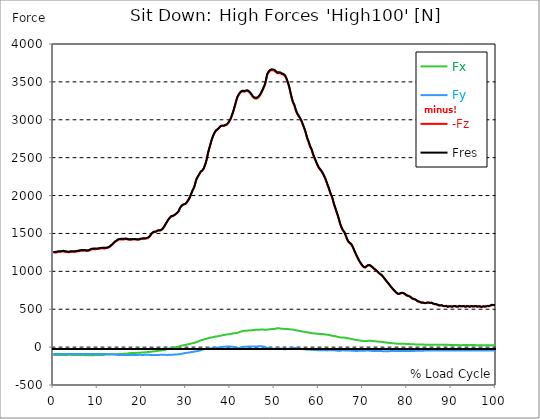
| Category |  Fx |  Fy |  -Fz |  Fres |
|---|---|---|---|---|
| 0.0 | -102.893 | -89.936 | 1247.755 | 1255.406 |
| 0.167348456675344 | -103.119 | -89.895 | 1247.982 | 1255.653 |
| 0.334696913350688 | -103.428 | -89.854 | 1248.557 | 1256.249 |
| 0.5020453700260321 | -103.366 | -89.998 | 1249.401 | 1257.092 |
| 0.669393826701376 | -102.831 | -90.306 | 1249.75 | 1257.421 |
| 0.83674228337672 | -102.831 | -90.121 | 1252.074 | 1259.704 |
| 1.0040907400520642 | -103.16 | -89.792 | 1255.612 | 1263.221 |
| 1.1621420602454444 | -103.428 | -89.895 | 1256.64 | 1264.27 |
| 1.3294905169207885 | -103.654 | -90.06 | 1257.298 | 1264.969 |
| 1.4968389735961325 | -103.345 | -90.45 | 1257.092 | 1264.764 |
| 1.6641874302714765 | -103.243 | -90.862 | 1257.792 | 1265.483 |
| 1.8315358869468206 | -103.469 | -91.15 | 1259.684 | 1267.417 |
| 1.9988843436221646 | -104.004 | -91.273 | 1261.74 | 1269.494 |
| 2.1662328002975086 | -104.168 | -91.273 | 1262.419 | 1270.193 |
| 2.333581256972853 | -104.189 | -91.417 | 1262.501 | 1270.275 |
| 2.5009297136481967 | -104.765 | -91.335 | 1261.041 | 1268.856 |
| 2.6682781703235405 | -104.148 | -91.787 | 1256.475 | 1264.291 |
| 2.8356266269988843 | -103.243 | -91.52 | 1256.208 | 1263.941 |
| 3.002975083674229 | -103.345 | -91.109 | 1255.961 | 1263.674 |
| 3.1703235403495724 | -103.407 | -91.273 | 1252.938 | 1260.691 |
| 3.337671997024917 | -102.358 | -91.396 | 1251.622 | 1259.314 |
| 3.4957233172182973 | -101.885 | -91.355 | 1252.054 | 1259.684 |
| 3.663071773893641 | -101.782 | -91.253 | 1253 | 1260.609 |
| 3.8304202305689854 | -101.844 | -91.191 | 1254.645 | 1262.255 |
| 3.997768687244329 | -102.461 | -91.191 | 1257.812 | 1265.442 |
| 4.165117143919673 | -103.428 | -91.191 | 1258.306 | 1265.998 |
| 4.332465600595017 | -103.448 | -91.623 | 1258.47 | 1266.203 |
| 4.499814057270361 | -103.777 | -91.726 | 1258.82 | 1266.573 |
| 4.667162513945706 | -103.777 | -91.787 | 1256.619 | 1264.414 |
| 4.834510970621049 | -103.202 | -91.993 | 1254.624 | 1262.398 |
| 5.001859427296393 | -102.831 | -91.808 | 1257.113 | 1264.825 |
| 5.169207883971737 | -103.551 | -91.294 | 1260.918 | 1268.61 |
| 5.336556340647081 | -104.312 | -91.17 | 1263.324 | 1271.077 |
| 5.503904797322425 | -105.155 | -91.582 | 1263.735 | 1271.571 |
| 5.671253253997769 | -104.6 | -91.787 | 1264.249 | 1272.044 |
| 5.82930457419115 | -104.497 | -91.828 | 1266.635 | 1274.409 |
| 5.996653030866494 | -104.847 | -91.787 | 1269.741 | 1277.515 |
| 6.164001487541838 | -105.279 | -91.643 | 1272.394 | 1280.188 |
| 6.331349944217181 | -105.628 | -91.643 | 1273.813 | 1281.628 |
| 6.498698400892526 | -105.32 | -91.972 | 1273.319 | 1281.134 |
| 6.66604685756787 | -104.415 | -92.63 | 1271.098 | 1278.913 |
| 6.833395314243213 | -103.983 | -92.61 | 1273.443 | 1281.196 |
| 7.000743770918558 | -105.628 | -92.425 | 1274.635 | 1282.512 |
| 7.168092227593902 | -106.184 | -92.322 | 1272.25 | 1280.168 |
| 7.335440684269246 | -105.978 | -92.301 | 1269.987 | 1277.926 |
| 7.50278914094459 | -105.238 | -92.178 | 1268.671 | 1276.528 |
| 7.6701375976199335 | -105.608 | -91.808 | 1268.877 | 1276.713 |
| 7.837486054295278 | -105.855 | -92.116 | 1269.617 | 1277.494 |
| 7.995537374488658 | -106.101 | -92.219 | 1272.579 | 1280.476 |
| 8.162885831164003 | -107.562 | -91.89 | 1277.186 | 1285.145 |
| 8.330234287839346 | -107.767 | -91.849 | 1280.661 | 1288.62 |
| 8.49758274451469 | -107.623 | -91.602 | 1284.055 | 1291.973 |
| 8.664931201190035 | -107.376 | -91.047 | 1290.842 | 1298.657 |
| 8.832279657865378 | -107.027 | -91.047 | 1292.014 | 1299.767 |
| 8.999628114540721 | -105.834 | -90.903 | 1292.302 | 1299.973 |
| 9.166976571216066 | -106.574 | -90.759 | 1293.639 | 1301.351 |
| 9.334325027891412 | -106.06 | -90.862 | 1291.993 | 1299.685 |
| 9.501673484566755 | -105.32 | -90.841 | 1292.034 | 1299.665 |
| 9.669021941242098 | -105.011 | -90.759 | 1293.145 | 1300.755 |
| 9.836370397917442 | -106.369 | -89.998 | 1296.847 | 1304.498 |
| 10.003718854592787 | -105.546 | -90.409 | 1294.276 | 1301.906 |
| 10.17106731126813 | -104.847 | -90.224 | 1295.675 | 1303.243 |
| 10.329118631461512 | -104.538 | -90.265 | 1297.793 | 1305.32 |
| 10.496467088136853 | -105.258 | -90.43 | 1300.611 | 1308.22 |
| 10.663815544812199 | -104.374 | -90.985 | 1300.94 | 1308.529 |
| 10.831164001487544 | -104.477 | -91.479 | 1303.325 | 1310.955 |
| 10.998512458162887 | -104.662 | -91.705 | 1304.086 | 1311.758 |
| 11.16586091483823 | -103.345 | -91.767 | 1304.477 | 1312.025 |
| 11.333209371513574 | -102.317 | -91.952 | 1302.77 | 1310.277 |
| 11.50055782818892 | -100.59 | -91.931 | 1302.667 | 1310.071 |
| 11.667906284864264 | -99.5 | -91.911 | 1302.729 | 1310.051 |
| 11.835254741539607 | -98.554 | -92.034 | 1302.462 | 1309.721 |
| 12.00260319821495 | -98.41 | -92.343 | 1305.464 | 1312.765 |
| 12.169951654890292 | -97.546 | -92.816 | 1307.274 | 1314.513 |
| 12.337300111565641 | -98.286 | -93.021 | 1310.955 | 1318.256 |
| 12.504648568240984 | -96.785 | -93.556 | 1312.642 | 1319.881 |
| 12.662699888434362 | -96.332 | -93.947 | 1318.976 | 1326.195 |
| 12.830048345109708 | -95.839 | -94.461 | 1326.277 | 1333.496 |
| 12.997396801785053 | -94.831 | -94.749 | 1335.758 | 1342.915 |
| 13.164745258460396 | -94.79 | -94.831 | 1344.684 | 1351.841 |
| 13.33209371513574 | -94.276 | -95.469 | 1351.142 | 1358.32 |
| 13.499442171811083 | -94.111 | -96.086 | 1360.335 | 1367.533 |
| 13.666790628486426 | -94.625 | -96.764 | 1372.346 | 1379.606 |
| 13.834139085161771 | -94.296 | -97.649 | 1382.403 | 1389.683 |
| 14.001487541837117 | -93.741 | -98.122 | 1390.197 | 1397.478 |
| 14.16883599851246 | -93.638 | -99.191 | 1396.449 | 1403.75 |
| 14.336184455187803 | -93.145 | -100.878 | 1401.488 | 1408.81 |
| 14.503532911863147 | -92.672 | -102.399 | 1408.563 | 1415.905 |
| 14.670881368538492 | -92.137 | -103.819 | 1416.111 | 1423.494 |
| 14.828932688731873 | -91.746 | -104.189 | 1420.224 | 1427.587 |
| 14.996281145407215 | -91.253 | -104.538 | 1420.491 | 1427.834 |
| 15.163629602082558 | -90.43 | -104.518 | 1420.471 | 1427.751 |
| 15.330978058757903 | -91.17 | -104.497 | 1421.561 | 1428.903 |
| 15.498326515433247 | -91.067 | -104.579 | 1421.499 | 1428.862 |
| 15.665674972108594 | -90.142 | -105.011 | 1420.985 | 1428.327 |
| 15.833023428783937 | -89.237 | -105.526 | 1421.088 | 1428.409 |
| 16.00037188545928 | -88.147 | -105.711 | 1421.273 | 1428.533 |
| 16.167720342134626 | -87.777 | -105.937 | 1423.947 | 1431.186 |
| 16.335068798809967 | -87.88 | -105.649 | 1426.085 | 1433.284 |
| 16.502417255485312 | -86.419 | -105.464 | 1424.893 | 1431.988 |
| 16.669765712160658 | -84.754 | -105.155 | 1423.083 | 1430.055 |
| 16.837114168836 | -82.8 | -104.6 | 1420.347 | 1427.196 |
| 17.004462625511344 | -81.586 | -104.25 | 1418.147 | 1424.913 |
| 17.16251394570472 | -80.414 | -103.901 | 1416.234 | 1422.939 |
| 17.32986240238007 | -79.427 | -103.263 | 1417.962 | 1424.584 |
| 17.497210859055414 | -78.933 | -102.975 | 1417.9 | 1424.522 |
| 17.664559315730756 | -78.357 | -102.996 | 1417.735 | 1424.317 |
| 17.8319077724061 | -78.769 | -103.016 | 1420.409 | 1427.031 |
| 17.999256229081443 | -78.419 | -102.955 | 1421.355 | 1427.957 |
| 18.166604685756788 | -78.049 | -102.667 | 1421.335 | 1427.916 |
| 18.333953142432133 | -77 | -102.749 | 1420.43 | 1426.97 |
| 18.501301599107478 | -76.445 | -103.058 | 1420.615 | 1427.134 |
| 18.668650055782823 | -76.753 | -102.811 | 1419.196 | 1425.756 |
| 18.835998512458165 | -75.89 | -103.078 | 1416.296 | 1422.836 |
| 19.00334696913351 | -75.581 | -102.975 | 1415.555 | 1422.075 |
| 19.170695425808855 | -75.293 | -102.831 | 1415.062 | 1421.561 |
| 19.338043882484197 | -74.368 | -102.297 | 1417.365 | 1423.782 |
| 19.496095202677576 | -73.936 | -101.7 | 1421.047 | 1427.402 |
| 19.66344365935292 | -73.463 | -101.577 | 1424.296 | 1430.631 |
| 19.830792116028263 | -72.229 | -102.667 | 1424.995 | 1431.33 |
| 19.998140572703612 | -71.941 | -103.14 | 1427.875 | 1434.189 |
| 20.165489029378953 | -71.447 | -102.914 | 1430.055 | 1436.348 |
| 20.3328374860543 | -71.015 | -102.749 | 1429.582 | 1435.834 |
| 20.500185942729644 | -70.193 | -102.564 | 1428.841 | 1435.052 |
| 20.667534399404985 | -68.897 | -102.297 | 1429.314 | 1435.422 |
| 20.83488285608033 | -67.807 | -102.214 | 1432.749 | 1438.816 |
| 21.002231312755672 | -67.211 | -102.276 | 1432.625 | 1438.693 |
| 21.16957976943102 | -65.956 | -102.07 | 1435.443 | 1441.407 |
| 21.336928226106362 | -65.483 | -101.762 | 1439.001 | 1444.924 |
| 21.504276682781704 | -64.804 | -101.68 | 1442.785 | 1448.667 |
| 21.67162513945705 | -63.858 | -101.947 | 1451.115 | 1456.935 |
| 21.82967645965043 | -62.912 | -102.07 | 1461.603 | 1467.362 |
| 21.997024916325774 | -61.575 | -103.263 | 1476.946 | 1482.663 |
| 22.16437337300112 | -60.3 | -104.312 | 1491.939 | 1497.635 |
| 22.33172182967646 | -58.717 | -104.435 | 1503.25 | 1508.885 |
| 22.499070286351806 | -57.215 | -104.004 | 1510.078 | 1515.631 |
| 22.666418743027148 | -55.817 | -103.839 | 1515.466 | 1520.937 |
| 22.833767199702496 | -55.035 | -104.045 | 1518.634 | 1524.063 |
| 23.00111565637784 | -54.418 | -104.065 | 1519.868 | 1525.235 |
| 23.168464113053183 | -53.061 | -104.168 | 1520.217 | 1525.503 |
| 23.335812569728528 | -51.95 | -104.127 | 1525.215 | 1530.439 |
| 23.50316102640387 | -50.346 | -103.921 | 1532.434 | 1537.575 |
| 23.670509483079215 | -48.907 | -103.654 | 1536.382 | 1541.442 |
| 23.83785793975456 | -47.446 | -103.551 | 1538.459 | 1543.437 |
| 23.995909259947936 | -46.212 | -103.037 | 1538.418 | 1543.272 |
| 24.163257716623285 | -45.349 | -101.926 | 1537.719 | 1542.449 |
| 24.330606173298627 | -44.3 | -101.556 | 1541.236 | 1545.904 |
| 24.49795462997397 | -42.901 | -101.063 | 1547.653 | 1552.259 |
| 24.665303086649313 | -41.832 | -101.803 | 1557.01 | 1561.617 |
| 24.83265154332466 | -40.084 | -102.399 | 1568.61 | 1573.216 |
| 25.0 | -37.842 | -102.646 | 1581.073 | 1585.618 |
| 25.167348456675345 | -34.86 | -102.235 | 1597.67 | 1602.174 |
| 25.334696913350694 | -31.569 | -101.515 | 1616.015 | 1620.478 |
| 25.502045370026035 | -29.533 | -102.461 | 1632.694 | 1637.178 |
| 25.669393826701377 | -26.243 | -103.325 | 1647.461 | 1651.965 |
| 25.836742283376722 | -22.87 | -102.194 | 1665.6 | 1670.104 |
| 26.004090740052067 | -20.731 | -102.194 | 1681.498 | 1686.022 |
| 26.17143919672741 | -19.291 | -103.016 | 1693.879 | 1698.424 |
| 26.329490516920792 | -17.132 | -102.934 | 1704.47 | 1708.974 |
| 26.49683897359613 | -14.499 | -102.132 | 1715.329 | 1719.772 |
| 26.66418743027148 | -12.299 | -101.186 | 1725.345 | 1729.767 |
| 26.831535886946828 | -11.106 | -101.186 | 1727.361 | 1731.721 |
| 26.998884343622166 | -9.46 | -100.59 | 1728.924 | 1733.16 |
| 27.166232800297514 | -7.712 | -99.973 | 1730.877 | 1735.011 |
| 27.333581256972852 | -5.162 | -98.533 | 1738.672 | 1742.724 |
| 27.5009297136482 | -3.311 | -97.916 | 1746.138 | 1750.127 |
| 27.668278170323543 | -1.707 | -97.422 | 1753.912 | 1757.84 |
| 27.835626626998888 | -0.35 | -97.381 | 1761.912 | 1765.799 |
| 28.002975083674233 | 1.584 | -95.571 | 1769.439 | 1773.203 |
| 28.170323540349575 | 3.805 | -94.214 | 1778.797 | 1782.458 |
| 28.33767199702492 | 6.273 | -92.528 | 1792.124 | 1795.682 |
| 28.50502045370026 | 10.077 | -92.404 | 1816.022 | 1819.621 |
| 28.663071773893645 | 13.759 | -93.145 | 1836.012 | 1839.714 |
| 28.830420230568986 | 16.905 | -91.026 | 1851.478 | 1855.18 |
| 28.99776868724433 | 19.476 | -88.168 | 1863.962 | 1867.623 |
| 29.165117143919673 | 21.163 | -86.029 | 1871.53 | 1875.109 |
| 29.33246560059502 | 22.849 | -83.91 | 1878.811 | 1882.286 |
| 29.499814057270367 | 24.556 | -82.183 | 1882.924 | 1886.358 |
| 29.66716251394571 | 26.592 | -80.394 | 1884.384 | 1887.757 |
| 29.834510970621054 | 28.916 | -77.946 | 1887.428 | 1890.698 |
| 30.00185942729639 | 30.829 | -76.26 | 1896.765 | 1899.953 |
| 30.169207883971744 | 32.968 | -74.923 | 1908.776 | 1911.963 |
| 30.33655634064708 | 35.456 | -74.203 | 1923.357 | 1926.545 |
| 30.50390479732243 | 37.842 | -73.134 | 1937.589 | 1940.756 |
| 30.671253253997772 | 39.919 | -72.146 | 1955.523 | 1958.669 |
| 30.829304574191156 | 42.922 | -69.864 | 1973.765 | 1976.85 |
| 30.996653030866494 | 45.225 | -67.334 | 1995.833 | 1998.856 |
| 31.164001487541842 | 46.562 | -66.326 | 2021.828 | 2024.831 |
| 31.331349944217187 | 48.619 | -65.154 | 2046.364 | 2049.305 |
| 31.498698400892525 | 51.292 | -64.146 | 2068.637 | 2071.517 |
| 31.666046857567874 | 53.287 | -61.884 | 2087.435 | 2090.191 |
| 31.833395314243212 | 55.549 | -59.848 | 2109.811 | 2112.464 |
| 32.00074377091856 | 58.573 | -58.593 | 2141.771 | 2144.424 |
| 32.1680922275939 | 62.069 | -57.503 | 2178.502 | 2181.238 |
| 32.33544068426925 | 65.504 | -55.652 | 2210.771 | 2213.568 |
| 32.50278914094459 | 68.918 | -53.267 | 2232.077 | 2234.833 |
| 32.670137597619934 | 73.175 | -51.333 | 2248.757 | 2251.492 |
| 32.83748605429528 | 77.884 | -50.346 | 2265.703 | 2268.48 |
| 33.004834510970625 | 81.628 | -46.274 | 2282.177 | 2284.871 |
| 33.162885831164004 | 85.227 | -41.688 | 2298.568 | 2301.18 |
| 33.33023428783935 | 89.196 | -39.426 | 2315.926 | 2318.558 |
| 33.497582744514695 | 91.931 | -36.649 | 2322.589 | 2325.304 |
| 33.664931201190036 | 94.358 | -33.461 | 2328.183 | 2330.939 |
| 33.83227965786538 | 97.155 | -30.603 | 2337.5 | 2340.359 |
| 33.99962811454073 | 100.219 | -29.595 | 2356.051 | 2359.074 |
| 34.16697657121607 | 102.749 | -27.97 | 2381.903 | 2385.008 |
| 34.33432502789141 | 105.443 | -25.194 | 2407.816 | 2410.942 |
| 34.50167348456676 | 107.87 | -23.116 | 2438.707 | 2441.853 |
| 34.6690219412421 | 109.968 | -21.553 | 2475.006 | 2478.194 |
| 34.83637039791744 | 112.888 | -20.052 | 2520.745 | 2524.036 |
| 35.00371885459279 | 116.611 | -19.065 | 2567.246 | 2570.66 |
| 35.17106731126814 | 119.593 | -17.872 | 2603.401 | 2606.856 |
| 35.338415767943474 | 121.855 | -16.885 | 2637.521 | 2641.038 |
| 35.49646708813686 | 124.22 | -16.7 | 2672.586 | 2676.185 |
| 35.6638155448122 | 126.688 | -17.049 | 2708.042 | 2711.724 |
| 35.831164001487544 | 128.107 | -16.803 | 2740.825 | 2744.527 |
| 35.998512458162885 | 130.452 | -16.309 | 2767.438 | 2771.263 |
| 36.165860914838234 | 132.981 | -14.993 | 2791.665 | 2795.572 |
| 36.333209371513576 | 135.141 | -14.232 | 2813.157 | 2817.167 |
| 36.50055782818892 | 137.876 | -12.772 | 2831.81 | 2835.965 |
| 36.667906284864266 | 139.151 | -11.085 | 2846.906 | 2851.122 |
| 36.83525474153961 | 140.241 | -9.214 | 2860.336 | 2864.593 |
| 37.002603198214956 | 141.681 | -7.589 | 2867.513 | 2871.873 |
| 37.1699516548903 | 143.409 | -6.232 | 2872.778 | 2877.241 |
| 37.337300111565646 | 144.93 | -4.936 | 2881.231 | 2885.776 |
| 37.50464856824098 | 146.823 | -3.517 | 2892.892 | 2897.54 |
| 37.66269988843437 | 149.105 | -1.789 | 2904.964 | 2909.756 |
| 37.83004834510971 | 151.429 | -0.103 | 2913.643 | 2918.6 |
| 37.99739680178505 | 153.753 | 1.563 | 2918.394 | 2923.515 |
| 38.16474525846039 | 155.851 | 3.085 | 2919.032 | 2924.317 |
| 38.33209371513574 | 157.743 | 3.599 | 2918.847 | 2924.276 |
| 38.49944217181109 | 159.635 | 4.134 | 2918.662 | 2924.235 |
| 38.666790628486424 | 161.137 | 4.648 | 2921.788 | 2927.484 |
| 38.83413908516178 | 162.659 | 5.656 | 2924.132 | 2929.952 |
| 39.001487541837115 | 164.242 | 6.561 | 2927.361 | 2933.325 |
| 39.16883599851246 | 166.031 | 7.095 | 2933.346 | 2939.433 |
| 39.336184455187805 | 167.78 | 7.712 | 2939.783 | 2946.015 |
| 39.503532911863154 | 168.89 | 7.795 | 2950.909 | 2957.244 |
| 39.670881368538495 | 169.754 | 7.404 | 2966.56 | 2972.956 |
| 39.83822982521384 | 170.988 | 7.815 | 2983.157 | 2989.656 |
| 39.996281145407224 | 172.078 | 7.774 | 3000.392 | 3006.973 |
| 40.163629602082565 | 173.6 | 7.239 | 3021.287 | 3027.971 |
| 40.33097805875791 | 175.903 | 5.779 | 3049.031 | 3055.859 |
| 40.498326515433256 | 178.885 | 5.903 | 3076.981 | 3083.953 |
| 40.6656749721086 | 181.867 | 4.607 | 3104.272 | 3111.388 |
| 40.83302342878393 | 182.361 | 2.447 | 3138.104 | 3145.22 |
| 41.00037188545929 | 183.081 | -0.165 | 3171.01 | 3178.146 |
| 41.16772034213463 | 183.718 | -3.62 | 3206.178 | 3213.376 |
| 41.33506879880997 | 184.521 | -7.363 | 3242.724 | 3249.984 |
| 41.50241725548531 | 186.803 | -10.571 | 3277.851 | 3285.214 |
| 41.66976571216066 | 188.49 | -11.455 | 3302.058 | 3309.482 |
| 41.837114168836 | 192.212 | -10.9 | 3319.786 | 3327.498 |
| 42.004462625511344 | 196.161 | -10.612 | 3336.424 | 3344.445 |
| 42.17181108218669 | 200.398 | -9.543 | 3349.936 | 3358.307 |
| 42.32986240238007 | 204.367 | -7.383 | 3361.7 | 3370.4 |
| 42.497210859055414 | 206.958 | -3.887 | 3369.31 | 3378.194 |
| 42.66455931573076 | 208.994 | -0.679 | 3372.97 | 3382.122 |
| 42.831907772406105 | 212.779 | 0.535 | 3374.616 | 3384.241 |
| 42.999256229081446 | 214.609 | 3.702 | 3371.366 | 3381.238 |
| 43.16660468575679 | 215.39 | 6.046 | 3369.844 | 3379.819 |
| 43.33395314243214 | 216.11 | 5.347 | 3372.415 | 3382.431 |
| 43.50130159910748 | 216.295 | 5.615 | 3376.775 | 3386.709 |
| 43.66865005578282 | 216.439 | 5.656 | 3380.21 | 3390.102 |
| 43.83599851245817 | 216.912 | 5.656 | 3380.703 | 3390.616 |
| 44.00334696913351 | 218.352 | 6.725 | 3377.269 | 3387.326 |
| 44.17069542580886 | 220.368 | 8.185 | 3370.07 | 3380.292 |
| 44.3380438824842 | 221.828 | 7.568 | 3360.487 | 3370.77 |
| 44.49609520267758 | 220.923 | 6.972 | 3350.574 | 3360.692 |
| 44.66344365935292 | 219.586 | 6.602 | 3339.9 | 3349.874 |
| 44.83079211602827 | 221.396 | 5.717 | 3325.915 | 3336.116 |
| 44.99814057270361 | 223.432 | 7.28 | 3309.544 | 3319.889 |
| 45.16548902937895 | 224.728 | 8.638 | 3296.937 | 3307.364 |
| 45.332837486054295 | 225.818 | 9.296 | 3288.813 | 3299.343 |
| 45.500185942729644 | 227.813 | 8.268 | 3282.582 | 3293.297 |
| 45.66753439940499 | 228.676 | 7.075 | 3279.312 | 3290.109 |
| 45.83488285608033 | 228.594 | 7.404 | 3279.003 | 3289.841 |
| 46.00223131275568 | 228.286 | 8.514 | 3281.245 | 3292.104 |
| 46.16957976943102 | 228.656 | 9.748 | 3286.613 | 3297.513 |
| 46.336928226106366 | 229.91 | 10.818 | 3293.955 | 3304.978 |
| 46.50427668278171 | 230.939 | 11.887 | 3303.333 | 3314.48 |
| 46.671625139457056 | 230.075 | 11.188 | 3316.783 | 3327.807 |
| 46.829676459650436 | 230.692 | 11.065 | 3333.853 | 3344.856 |
| 46.99702491632577 | 231.597 | 11.003 | 3351.643 | 3362.687 |
| 47.16437337300112 | 233.119 | 10.633 | 3371.531 | 3382.616 |
| 47.33172182967646 | 232.07 | 9.193 | 3390.349 | 3401.187 |
| 47.49907028635181 | 230.877 | 6.766 | 3414.267 | 3424.838 |
| 47.66641874302716 | 230.28 | 4.504 | 3437.343 | 3447.77 |
| 47.83376719970249 | 229.951 | 3.352 | 3459.966 | 3470.269 |
| 48.001115656377834 | 229.581 | -1.008 | 3496.8 | 3507.001 |
| 48.16846411305319 | 229.19 | -6.807 | 3544.863 | 3554.92 |
| 48.33581256972853 | 230.815 | -10.818 | 3588.628 | 3598.706 |
| 48.50316102640387 | 232.934 | -13.265 | 3611.518 | 3621.637 |
| 48.67050948307921 | 233.736 | -14.52 | 3627.169 | 3637.288 |
| 48.837857939754564 | 234.867 | -15.301 | 3639.715 | 3649.895 |
| 49.005206396429905 | 236.471 | -16.083 | 3646.954 | 3657.176 |
| 49.163257716623285 | 237.006 | -17.605 | 3652.301 | 3662.584 |
| 49.33060617329863 | 237.911 | -19.415 | 3655.633 | 3666.019 |
| 49.49795462997397 | 239.227 | -21.348 | 3656.6 | 3667.13 |
| 49.66530308664932 | 240.605 | -22.499 | 3653.844 | 3664.477 |
| 49.832651543324666 | 240.543 | -23.61 | 3651.314 | 3661.926 |
| 50.0 | 240.235 | -23.733 | 3647.509 | 3658.101 |
| 50.16734845667534 | 243.093 | -20.422 | 3639.036 | 3649.813 |
| 50.33469691335069 | 245.191 | -18.366 | 3628.506 | 3639.447 |
| 50.50204537002604 | 247.309 | -16.288 | 3617.997 | 3629.082 |
| 50.66939382670139 | 248.399 | -13.533 | 3613.102 | 3624.228 |
| 50.836742283376715 | 248.173 | -14.746 | 3614.83 | 3625.894 |
| 51.00409074005207 | 247.906 | -16.083 | 3616.742 | 3627.766 |
| 51.17143919672741 | 247.494 | -18.325 | 3617.154 | 3628.136 |
| 51.32949051692079 | 245.52 | -19.517 | 3613.02 | 3623.879 |
| 51.496838973596134 | 240.111 | -19.559 | 3608.331 | 3618.799 |
| 51.66418743027148 | 241.736 | -24.268 | 3601.153 | 3611.786 |
| 51.831535886946824 | 242.25 | -27.394 | 3596.628 | 3607.364 |
| 51.99888434362217 | 241.078 | -27.23 | 3594.819 | 3605.451 |
| 52.16623280029752 | 239.926 | -26.798 | 3592.783 | 3603.333 |
| 52.33358125697285 | 239.515 | -27.25 | 3579.949 | 3590.5 |
| 52.5009297136482 | 238.857 | -27.065 | 3562.694 | 3573.245 |
| 52.668278170323546 | 238.939 | -25.461 | 3541.922 | 3552.514 |
| 52.835626626998895 | 238.898 | -24.433 | 3516.543 | 3527.156 |
| 53.00297508367424 | 238.322 | -23.528 | 3489.293 | 3499.926 |
| 53.17032354034958 | 237.273 | -22.746 | 3459.657 | 3470.29 |
| 53.33767199702492 | 236.306 | -20.957 | 3424.962 | 3435.615 |
| 53.50502045370027 | 235.566 | -17.378 | 3384.385 | 3395.017 |
| 53.663071773893655 | 233.448 | -14.705 | 3337.823 | 3348.332 |
| 53.83042023056899 | 231.268 | -13.409 | 3296.916 | 3307.302 |
| 53.99776868724433 | 231.268 | -10.468 | 3258.951 | 3269.399 |
| 54.16511714391967 | 231.227 | -8.843 | 3227.773 | 3238.323 |
| 54.33246560059503 | 229.663 | -10.201 | 3206.301 | 3216.811 |
| 54.49981405727037 | 226.866 | -11.435 | 3185.961 | 3196.306 |
| 54.667162513945705 | 223.987 | -12.237 | 3153.343 | 3163.565 |
| 54.834510970621054 | 221.231 | -13.121 | 3120.972 | 3131.07 |
| 55.0018594272964 | 219.853 | -14.705 | 3094.297 | 3104.334 |
| 55.169207883971744 | 219.421 | -15.26 | 3073.196 | 3083.233 |
| 55.336556340647086 | 217.756 | -16.494 | 3056.682 | 3066.595 |
| 55.50390479732243 | 215.411 | -17.666 | 3042.162 | 3051.869 |
| 55.671253253997776 | 213.046 | -18.818 | 3027.663 | 3037.144 |
| 55.83860171067312 | 210.804 | -20.134 | 3011.107 | 3020.403 |
| 55.9966530308665 | 208.665 | -21.677 | 2992.001 | 3001.173 |
| 56.16400148754184 | 206.876 | -23.158 | 2970.818 | 2979.887 |
| 56.33134994421718 | 205.436 | -24.392 | 2944.904 | 2953.974 |
| 56.498698400892536 | 204.161 | -25.461 | 2917.407 | 2926.436 |
| 56.66604685756788 | 203.092 | -27.641 | 2893.488 | 2902.496 |
| 56.83339531424321 | 201.159 | -29.06 | 2866.238 | 2875.226 |
| 57.00074377091856 | 199.164 | -30.603 | 2837.281 | 2846.207 |
| 57.16809222759391 | 197.498 | -31.343 | 2800.981 | 2809.907 |
| 57.33544068426925 | 195.873 | -31.22 | 2765.834 | 2774.739 |
| 57.5027891409446 | 194.187 | -31.775 | 2734.943 | 2743.828 |
| 57.670137597619934 | 192.809 | -33.132 | 2713.081 | 2721.925 |
| 57.83748605429528 | 190.156 | -33.955 | 2682.828 | 2691.548 |
| 58.004834510970625 | 187.482 | -35.991 | 2653.48 | 2662.118 |
| 58.16288583116401 | 186.742 | -36.114 | 2629.623 | 2638.302 |
| 58.330234287839346 | 185.898 | -36.567 | 2611.689 | 2620.348 |
| 58.497582744514695 | 184.438 | -35.868 | 2583.966 | 2592.583 |
| 58.66493120119004 | 182.402 | -35.826 | 2550.32 | 2558.875 |
| 58.832279657865385 | 181.004 | -36.958 | 2523.337 | 2531.892 |
| 58.999628114540734 | 179.914 | -37.76 | 2498.822 | 2507.418 |
| 59.16697657121607 | 178.865 | -37.904 | 2474.389 | 2483.027 |
| 59.33432502789142 | 178.31 | -37.677 | 2452.095 | 2460.795 |
| 59.50167348456676 | 177.281 | -38.582 | 2427.992 | 2436.732 |
| 59.66902194124211 | 176.191 | -39.899 | 2402.983 | 2411.744 |
| 59.83637039791745 | 175.595 | -40.207 | 2384.432 | 2393.235 |
| 60.00371885459278 | 174.525 | -40.186 | 2366.684 | 2375.486 |
| 60.17106731126813 | 174.032 | -41.112 | 2351.958 | 2360.802 |
| 60.33841576794349 | 173.764 | -40.989 | 2339.803 | 2348.647 |
| 60.49646708813685 | 173.497 | -40.865 | 2327.649 | 2336.492 |
| 60.6638155448122 | 173.168 | -40.762 | 2315.165 | 2324.029 |
| 60.831164001487544 | 172.181 | -41.194 | 2297.725 | 2306.568 |
| 60.99851245816289 | 171.173 | -41.647 | 2280.264 | 2289.108 |
| 61.16586091483824 | 170.021 | -41.893 | 2259.965 | 2268.788 |
| 61.333209371513576 | 168.767 | -42.017 | 2237.836 | 2246.659 |
| 61.50055782818892 | 166.875 | -41.359 | 2218.195 | 2226.936 |
| 61.667906284864266 | 165.188 | -42.367 | 2190.287 | 2198.986 |
| 61.835254741539615 | 163.893 | -42.552 | 2164.373 | 2173.032 |
| 62.002603198214956 | 163.975 | -43.477 | 2134.861 | 2143.601 |
| 62.16995165489029 | 162.165 | -43.457 | 2111.292 | 2119.971 |
| 62.33730011156564 | 159.738 | -42.079 | 2083.548 | 2092.124 |
| 62.504648568240995 | 156.879 | -41.215 | 2053.891 | 2062.303 |
| 62.67199702491633 | 155.131 | -40.906 | 2022.774 | 2031.104 |
| 62.83004834510971 | 154.165 | -42.86 | 2000.275 | 2008.666 |
| 62.99739680178505 | 150.319 | -41.133 | 1979.626 | 1987.688 |
| 63.1647452584604 | 147.254 | -41.4 | 1946.145 | 1953.96 |
| 63.33209371513575 | 146.576 | -41.153 | 1909.166 | 1916.858 |
| 63.4994421718111 | 145.753 | -41.42 | 1874.204 | 1881.813 |
| 63.666790628486424 | 144.478 | -43.189 | 1845.082 | 1852.671 |
| 63.83413908516177 | 143.08 | -43.457 | 1817.194 | 1824.742 |
| 64.00148754183712 | 140.838 | -44.773 | 1786.962 | 1794.407 |
| 64.16883599851248 | 137.444 | -46.644 | 1759.403 | 1766.683 |
| 64.3361844551878 | 133.578 | -48.742 | 1728.101 | 1735.196 |
| 64.50353291186315 | 130.904 | -49.914 | 1696.203 | 1703.236 |
| 64.6708813685385 | 129.691 | -50.017 | 1662.042 | 1669.076 |
| 64.83822982521384 | 129.033 | -48.228 | 1625.702 | 1632.694 |
| 65.00557828188919 | 127.717 | -46.603 | 1598.081 | 1605.012 |
| 65.16362960208257 | 126.256 | -44.834 | 1573.628 | 1580.497 |
| 65.3309780587579 | 124.94 | -42.696 | 1552.835 | 1559.643 |
| 65.49832651543326 | 124.94 | -42.325 | 1535.909 | 1542.758 |
| 65.6656749721086 | 126.195 | -42.881 | 1522.459 | 1529.513 |
| 65.83302342878395 | 127.449 | -43.436 | 1508.988 | 1516.248 |
| 66.00037188545929 | 123.912 | -45.513 | 1485.337 | 1492.391 |
| 66.16772034213463 | 121.074 | -46.048 | 1458.909 | 1465.819 |
| 66.33506879880998 | 118.811 | -45.863 | 1433.448 | 1440.214 |
| 66.50241725548531 | 117.187 | -45.554 | 1409.694 | 1416.378 |
| 66.66976571216065 | 116.241 | -44.855 | 1390.444 | 1397.108 |
| 66.83711416883601 | 112.724 | -43.271 | 1380.202 | 1386.516 |
| 67.00446262551135 | 112.21 | -44.135 | 1372.037 | 1378.331 |
| 67.1718110821867 | 110.852 | -45.554 | 1364.86 | 1371.112 |
| 67.32986240238007 | 109.207 | -46.953 | 1355.317 | 1361.507 |
| 67.49721085905541 | 107.068 | -48.351 | 1341.558 | 1347.687 |
| 67.66455931573076 | 104.785 | -49.092 | 1322.575 | 1328.581 |
| 67.83190777240611 | 102.091 | -49.565 | 1300.919 | 1306.78 |
| 67.99925622908145 | 99.685 | -49.606 | 1277.72 | 1283.397 |
| 68.16660468575678 | 97.751 | -49.626 | 1254.748 | 1260.321 |
| 68.33395314243214 | 96.044 | -49.832 | 1233.071 | 1238.603 |
| 68.50130159910749 | 94.667 | -50.141 | 1212.937 | 1218.428 |
| 68.66865005578282 | 93.33 | -50.058 | 1191.445 | 1196.895 |
| 68.83599851245816 | 92.055 | -49.421 | 1171.269 | 1176.658 |
| 69.00334696913352 | 90.553 | -49.112 | 1152.081 | 1157.428 |
| 69.17069542580886 | 88.641 | -49.462 | 1134.476 | 1139.782 |
| 69.3380438824842 | 87.263 | -49.174 | 1118.825 | 1124.07 |
| 69.50539233915956 | 85.556 | -49.75 | 1104.779 | 1109.92 |
| 69.66344365935292 | 83.705 | -49.256 | 1089.292 | 1094.352 |
| 69.83079211602826 | 81.751 | -48.557 | 1075.904 | 1080.819 |
| 69.99814057270362 | 80.044 | -48.248 | 1064.407 | 1069.22 |
| 70.16548902937896 | 78.83 | -48.084 | 1055.543 | 1060.294 |
| 70.33283748605429 | 78.645 | -47.22 | 1052.026 | 1056.798 |
| 70.50018594272964 | 78.584 | -46.48 | 1049.62 | 1054.391 |
| 70.667534399405 | 79.735 | -46.521 | 1057.373 | 1062.206 |
| 70.83488285608033 | 80.949 | -46.171 | 1064.654 | 1069.549 |
| 71.00223131275568 | 82.265 | -45.637 | 1071.112 | 1076.089 |
| 71.16957976943102 | 83.52 | -45.307 | 1077.446 | 1082.505 |
| 71.33692822610637 | 83.91 | -45.986 | 1078.001 | 1083.122 |
| 71.50427668278171 | 84.239 | -46.809 | 1077.837 | 1082.999 |
| 71.67162513945706 | 84.239 | -48.434 | 1073.559 | 1078.762 |
| 71.8389735961324 | 83.684 | -49.544 | 1067.698 | 1072.88 |
| 71.99702491632577 | 82.039 | -49.668 | 1058.772 | 1063.831 |
| 72.16437337300113 | 80.394 | -49.791 | 1049.846 | 1054.761 |
| 72.33172182967647 | 78.954 | -50.758 | 1040.982 | 1045.836 |
| 72.49907028635181 | 77.761 | -51.971 | 1032.406 | 1037.218 |
| 72.66641874302715 | 77.473 | -52.382 | 1025.516 | 1030.349 |
| 72.8337671997025 | 76.692 | -52.547 | 1017.598 | 1022.411 |
| 73.00111565637783 | 75.91 | -52.711 | 1009.639 | 1014.41 |
| 73.16846411305319 | 75.293 | -52.465 | 1000.981 | 1005.732 |
| 73.33581256972853 | 74.429 | -52.218 | 991.191 | 995.901 |
| 73.50316102640387 | 72.825 | -52.485 | 979.839 | 984.466 |
| 73.67050948307921 | 71.961 | -52.3 | 970.933 | 975.52 |
| 73.83785793975457 | 71.468 | -51.992 | 963.797 | 968.363 |
| 74.00520639642991 | 70.193 | -52.814 | 958.923 | 963.427 |
| 74.16325771662328 | 69.637 | -52.629 | 950.881 | 955.365 |
| 74.33060617329863 | 68.63 | -52.732 | 940.886 | 945.349 |
| 74.49795462997398 | 67.478 | -53.184 | 930.109 | 934.511 |
| 74.66530308664932 | 66.079 | -53.39 | 917.893 | 922.253 |
| 74.83265154332466 | 64.043 | -54.007 | 904.833 | 909.111 |
| 75.00000000000001 | 61.904 | -53.513 | 892.247 | 896.381 |
| 75.16734845667534 | 60.65 | -53.267 | 879.167 | 883.259 |
| 75.3346969133507 | 59.58 | -53.411 | 867.465 | 871.495 |
| 75.50204537002605 | 58.408 | -53.513 | 855.803 | 859.793 |
| 75.66939382670138 | 57.812 | -53.164 | 844.615 | 848.605 |
| 75.83674228337672 | 56.475 | -53.164 | 833.016 | 836.924 |
| 76.00409074005208 | 54.789 | -53.164 | 819.854 | 823.679 |
| 76.17143919672742 | 53.842 | -52.979 | 806.177 | 809.982 |
| 76.33878765340276 | 53.575 | -52.485 | 795.051 | 798.855 |
| 76.49683897359614 | 52.588 | -52.238 | 782.896 | 786.66 |
| 76.66418743027148 | 51.683 | -51.909 | 770.844 | 774.587 |
| 76.83153588694682 | 50.758 | -51.601 | 759.348 | 763.029 |
| 76.99888434362218 | 49.503 | -51.416 | 749.579 | 753.198 |
| 77.16623280029752 | 48.125 | -51.128 | 739.81 | 743.347 |
| 77.33358125697285 | 47.138 | -50.634 | 728.395 | 731.892 |
| 77.5009297136482 | 46.171 | -50.408 | 719.696 | 723.13 |
| 77.66827817032356 | 45.225 | -50.161 | 711.017 | 714.39 |
| 77.83562662699889 | 44.217 | -49.935 | 703.983 | 707.315 |
| 78.00297508367423 | 43.374 | -50.367 | 700.795 | 704.107 |
| 78.17032354034959 | 43.066 | -50.634 | 699.747 | 703.058 |
| 78.33767199702493 | 43.498 | -50.675 | 700.816 | 704.148 |
| 78.50502045370027 | 44.629 | -51.066 | 708.426 | 711.84 |
| 78.67236891037561 | 45.122 | -51.066 | 713.094 | 716.529 |
| 78.83042023056899 | 45.307 | -50.922 | 713.793 | 717.228 |
| 78.99776868724433 | 45.205 | -50.943 | 712.415 | 715.85 |
| 79.16511714391969 | 44.896 | -51.066 | 709.68 | 713.135 |
| 79.33246560059503 | 44.608 | -51.189 | 706.965 | 710.4 |
| 79.49981405727036 | 43.6 | -51.004 | 699.315 | 702.708 |
| 79.66716251394571 | 42.613 | -50.758 | 689.669 | 693.021 |
| 79.83451097062107 | 41.75 | -50.655 | 681.545 | 684.877 |
| 80.00185942729641 | 41.441 | -50.902 | 676.692 | 680.044 |
| 80.16920788397174 | 41.194 | -51.395 | 676.075 | 679.468 |
| 80.33655634064709 | 40.516 | -51.416 | 674.162 | 677.514 |
| 80.50390479732243 | 39.508 | -51.189 | 668.979 | 672.27 |
| 80.67125325399778 | 38.994 | -51.58 | 664.188 | 667.499 |
| 80.83860171067312 | 38.13 | -51.354 | 655.735 | 659.025 |
| 80.99665303086651 | 37.287 | -51.148 | 647.837 | 651.107 |
| 81.16400148754184 | 36.711 | -50.634 | 638.829 | 642.079 |
| 81.3313499442172 | 36.587 | -50.264 | 633.523 | 636.752 |
| 81.49869840089255 | 36.567 | -50.161 | 632.515 | 635.744 |
| 81.66604685756786 | 36.32 | -49.853 | 628.526 | 631.755 |
| 81.83339531424322 | 36.176 | -49.709 | 626.86 | 630.068 |
| 82.00074377091858 | 35.621 | -49.277 | 621.369 | 624.536 |
| 82.16809222759392 | 34.963 | -48.865 | 613.697 | 616.823 |
| 82.33544068426926 | 34.757 | -48.516 | 605.759 | 608.864 |
| 82.50278914094459 | 34.346 | -48.331 | 600.699 | 603.805 |
| 82.67013759761994 | 34.263 | -48.187 | 600.082 | 603.167 |
| 82.83748605429528 | 33.667 | -47.775 | 596.175 | 599.219 |
| 83.00483451097062 | 33.379 | -47.282 | 591.054 | 594.077 |
| 83.17218296764597 | 33.338 | -47.282 | 586.694 | 589.738 |
| 83.33023428783935 | 33.379 | -47.282 | 584.226 | 587.27 |
| 83.4975827445147 | 33.42 | -47.344 | 586.015 | 589.059 |
| 83.66493120119004 | 33.297 | -46.891 | 586.18 | 589.182 |
| 83.83227965786537 | 32.556 | -46.315 | 582.087 | 585.049 |
| 83.99962811454073 | 32.556 | -45.781 | 578.817 | 581.758 |
| 84.16697657121607 | 32.618 | -45.39 | 578.303 | 581.203 |
| 84.33432502789142 | 32.68 | -45.246 | 580.935 | 583.794 |
| 84.50167348456677 | 32.721 | -45.328 | 585.604 | 588.463 |
| 84.6690219412421 | 32.68 | -45.328 | 587.29 | 590.17 |
| 84.83637039791745 | 32.639 | -45.451 | 586.344 | 589.244 |
| 85.0037188545928 | 31.878 | -45.431 | 582.498 | 585.378 |
| 85.17106731126813 | 31.878 | -45.513 | 581.018 | 583.897 |
| 85.33841576794349 | 32.31 | -45.061 | 580.442 | 583.321 |
| 85.50576422461883 | 32.454 | -45.534 | 584.493 | 587.373 |
| 85.66381554481221 | 32.289 | -45.431 | 581.491 | 584.37 |
| 85.83116400148755 | 32.083 | -45.225 | 574.457 | 577.336 |
| 85.99851245816289 | 32.371 | -44.876 | 569.295 | 572.195 |
| 86.16586091483823 | 32.7 | -44.526 | 565.511 | 568.39 |
| 86.33320937151358 | 32.844 | -44.485 | 563.701 | 566.601 |
| 86.50055782818893 | 32.865 | -44.876 | 565.367 | 568.287 |
| 86.66790628486427 | 32.351 | -44.834 | 563.454 | 566.374 |
| 86.83525474153961 | 31.343 | -44.937 | 558.23 | 561.13 |
| 87.00260319821496 | 30.973 | -45.04 | 552.842 | 555.762 |
| 87.16995165489031 | 31.096 | -44.793 | 548.975 | 551.916 |
| 87.33730011156564 | 31.24 | -44.547 | 546.569 | 549.51 |
| 87.504648568241 | 30.87 | -44.834 | 548.009 | 550.95 |
| 87.67199702491634 | 30.5 | -44.876 | 549.243 | 552.143 |
| 87.83004834510972 | 30.191 | -44.834 | 550.086 | 552.986 |
| 87.99739680178506 | 30.15 | -45.02 | 546.61 | 549.551 |
| 88.1647452584604 | 30.006 | -45.184 | 541.14 | 544.122 |
| 88.33209371513574 | 30.047 | -45.451 | 537.355 | 540.358 |
| 88.49944217181108 | 30.705 | -45.307 | 538.445 | 541.448 |
| 88.66679062848644 | 30.788 | -45.513 | 541.736 | 544.759 |
| 88.83413908516178 | 30.13 | -45.739 | 542.106 | 545.129 |
| 89.00148754183712 | 29.41 | -45.534 | 535.463 | 538.466 |
| 89.16883599851246 | 29.615 | -45.349 | 530.651 | 533.674 |
| 89.33618445518782 | 29.862 | -45.575 | 531.844 | 534.887 |
| 89.50353291186315 | 29.718 | -45.76 | 536.163 | 539.206 |
| 89.6708813685385 | 28.937 | -45.698 | 538.24 | 541.222 |
| 89.83822982521386 | 27.97 | -45.307 | 535.833 | 538.774 |
| 90.00557828188919 | 27.456 | -45.554 | 533.016 | 535.957 |
| 90.16362960208257 | 27.168 | -45.986 | 530.98 | 533.962 |
| 90.3309780587579 | 27.929 | -45.945 | 535.443 | 538.425 |
| 90.49832651543326 | 27.95 | -46.068 | 540.317 | 543.299 |
| 90.66567497210859 | 27.435 | -46.11 | 542.003 | 544.965 |
| 90.83302342878395 | 27.168 | -45.678 | 539.7 | 542.62 |
| 91.00037188545929 | 27.024 | -45.369 | 537.047 | 539.947 |
| 91.16772034213463 | 26.428 | -45.349 | 533.715 | 536.615 |
| 91.33506879880998 | 26.119 | -45.39 | 532.913 | 535.792 |
| 91.50241725548533 | 26.222 | -45.287 | 532.995 | 535.854 |
| 91.66976571216065 | 26.51 | -45.616 | 537.623 | 540.502 |
| 91.83711416883601 | 26.428 | -46.13 | 541.448 | 544.348 |
| 92.00446262551137 | 25.749 | -46.274 | 540.975 | 543.916 |
| 92.1718110821867 | 25.523 | -45.924 | 537.479 | 540.42 |
| 92.33915953886203 | 25.811 | -45.637 | 535.916 | 538.836 |
| 92.49721085905541 | 26.818 | -45.369 | 537.787 | 540.687 |
| 92.66455931573077 | 27.353 | -45.307 | 540.728 | 543.628 |
| 92.83190777240611 | 26.921 | -45.102 | 538.322 | 541.201 |
| 92.99925622908145 | 26.263 | -45.493 | 533.921 | 536.821 |
| 93.1666046857568 | 26.633 | -45.061 | 531.72 | 534.579 |
| 93.33395314243214 | 26.901 | -44.793 | 533.962 | 536.78 |
| 93.50130159910749 | 27.271 | -44.485 | 538.425 | 541.242 |
| 93.66865005578283 | 26.86 | -45.102 | 540.235 | 543.073 |
| 93.83599851245818 | 26.243 | -44.752 | 537.52 | 540.337 |
| 94.00334696913353 | 25.893 | -45.081 | 534.291 | 537.129 |
| 94.17069542580886 | 26.304 | -44.876 | 532.173 | 535.031 |
| 94.3380438824842 | 26.736 | -44.732 | 534.106 | 536.923 |
| 94.50539233915954 | 27.106 | -44.3 | 539.021 | 541.818 |
| 94.66344365935292 | 26.654 | -44.773 | 540.07 | 542.888 |
| 94.83079211602828 | 26.387 | -44.69 | 536.121 | 538.96 |
| 94.99814057270362 | 26.592 | -44.773 | 533.407 | 536.265 |
| 95.16548902937897 | 27.25 | -44.773 | 536.882 | 539.782 |
| 95.33283748605432 | 26.716 | -45.164 | 539.988 | 542.847 |
| 95.50018594272963 | 25.893 | -45.246 | 539.371 | 542.209 |
| 95.66753439940499 | 24.926 | -45.431 | 535.278 | 538.116 |
| 95.83488285608034 | 24.433 | -45.76 | 532.666 | 535.504 |
| 96.00223131275567 | 24.865 | -45.616 | 533.756 | 536.615 |
| 96.16957976943102 | 24.926 | -45.719 | 537.479 | 540.337 |
| 96.33692822610638 | 24.68 | -45.904 | 538.857 | 541.715 |
| 96.50427668278171 | 24.289 | -46.089 | 534.846 | 537.726 |
| 96.67162513945706 | 24.124 | -45.883 | 529.088 | 531.988 |
| 96.8389735961324 | 24.556 | -46.192 | 528.183 | 531.124 |
| 96.99702491632577 | 24.926 | -46.295 | 533.427 | 536.348 |
| 97.16437337300111 | 24.844 | -46.315 | 535.69 | 538.61 |
| 97.33172182967647 | 24.618 | -46.418 | 535.258 | 538.178 |
| 97.49907028635181 | 24.021 | -46.521 | 534.065 | 537.006 |
| 97.66641874302715 | 23.939 | -46.233 | 531.062 | 533.983 |
| 97.8337671997025 | 24.803 | -45.924 | 534.949 | 537.849 |
| 98.00111565637785 | 25.543 | -45.76 | 540.749 | 543.628 |
| 98.16846411305319 | 25.338 | -45.986 | 542.312 | 545.171 |
| 98.33581256972855 | 24.721 | -45.966 | 540.379 | 543.237 |
| 98.50316102640389 | 24.844 | -45.801 | 539.638 | 542.497 |
| 98.67050948307921 | 25.235 | -45.637 | 541.51 | 544.348 |
| 98.83785793975456 | 25.667 | -45.493 | 546.466 | 549.284 |
| 99.0052063964299 | 25.79 | -45.945 | 553.335 | 556.153 |
| 99.17255485310525 | 25.77 | -46.233 | 556.42 | 559.258 |
| 99.33060617329863 | 25.728 | -46.192 | 555.783 | 558.641 |
| 99.49795462997399 | 25.523 | -45.904 | 551.196 | 554.055 |
| 99.66530308664933 | 25.852 | -45.822 | 551.484 | 554.323 |
| 99.83265154332467 | 25.872 | -45.842 | 551.238 | 554.076 |
| 100.0 | 26.222 | -45.39 | 548.482 | 551.32 |